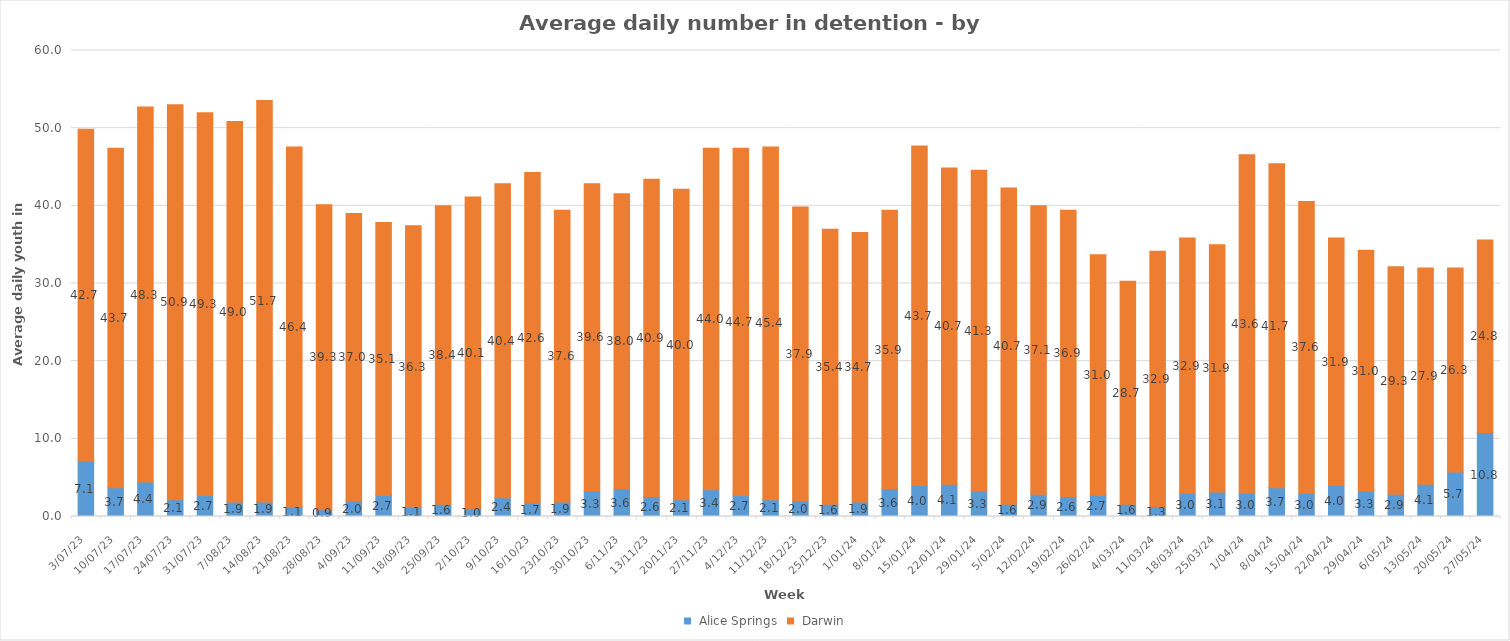
| Category |  Alice Springs |  Darwin |
|---|---|---|
| 3/07/23 | 7.143 | 42.714 |
| 10/07/23 | 3.714 | 43.714 |
| 17/07/23 | 4.429 | 48.286 |
| 24/07/23 | 2.143 | 50.857 |
| 31/07/23 | 2.714 | 49.286 |
| 7/08/23 | 1.857 | 49 |
| 14/08/23 | 1.857 | 51.714 |
| 21/08/23 | 1.143 | 46.429 |
| 28/08/23 | 0.857 | 39.286 |
| 4/09/23 | 2 | 37 |
| 11/09/23 | 2.714 | 35.143 |
| 18/09/23 | 1.143 | 36.286 |
| 25/09/23 | 1.571 | 38.429 |
| 2/10/23 | 1 | 40.143 |
| 9/10/23 | 2.429 | 40.429 |
| 16/10/23 | 1.714 | 42.571 |
| 23/10/23 | 1.857 | 37.571 |
| 30/10/23 | 3.286 | 39.571 |
| 6/11/23 | 3.571 | 38 |
| 13/11/23 | 2.571 | 40.857 |
| 20/11/23 | 2.143 | 40 |
| 27/11/23 | 3.429 | 44 |
| 4/12/23 | 2.714 | 44.714 |
| 11/12/23 | 2.143 | 45.429 |
| 18/12/23 | 2 | 37.857 |
| 25/12/23 | 1.571 | 35.429 |
| 1/01/24 | 1.857 | 34.714 |
| 8/01/24 | 3.571 | 35.857 |
| 15/01/24 | 4 | 43.714 |
| 22/01/24 | 4.143 | 40.714 |
| 29/01/24 | 3.286 | 41.286 |
| 5/02/24 | 1.571 | 40.714 |
| 12/02/24 | 2.857 | 37.143 |
| 19/02/24 | 2.571 | 36.857 |
| 26/02/24 | 2.714 | 31 |
| 4/03/24 | 1.571 | 28.714 |
| 11/03/24 | 1.286 | 32.857 |
| 18/03/24 | 3 | 32.857 |
| 25/03/24 | 3.143 | 31.857 |
| 1/04/24 | 3 | 43.571 |
| 8/04/24 | 3.714 | 41.714 |
| 15/04/24 | 3 | 37.571 |
| 22/04/24 | 4 | 31.857 |
| 29/04/24 | 3.286 | 31 |
| 6/05/24 | 2.857 | 29.286 |
| 13/05/24 | 4.143 | 27.857 |
| 20/05/24 | 5.714 | 26.286 |
| 27/05/24 | 10.8 | 24.8 |